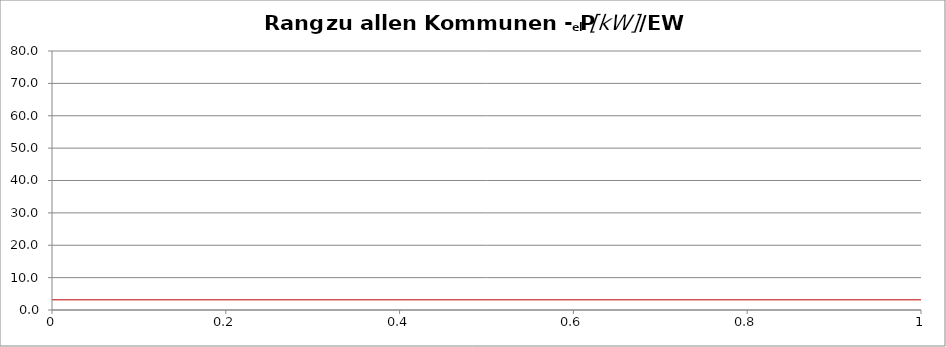
| Category | Kommunenrangfolge |
|---|---|
| 0 | 0.028 |
| 1 | 0.286 |
| 2 | 0.333 |
| 3 | 0.368 |
| 4 | 0.5 |
| 5 | 0.6 |
| 6 | 0.824 |
| 7 | 0.833 |
| 8 | 0.857 |
| 9 | 0.95 |
| 10 | 1 |
| 11 | 1 |
| 12 | 1 |
| 13 | 1 |
| 14 | 1 |
| 15 | 1 |
| 16 | 1 |
| 17 | 1 |
| 18 | 1 |
| 19 | 1 |
| 20 | 1 |
| 21 | 1 |
| 22 | 1 |
| 23 | 1.186 |
| 24 | 1.19 |
| 25 | 1.2 |
| 26 | 1.2 |
| 27 | 1.222 |
| 28 | 1.24 |
| 29 | 1.241 |
| 30 | 1.25 |
| 31 | 1.25 |
| 32 | 1.25 |
| 33 | 1.286 |
| 34 | 1.333 |
| 35 | 1.333 |
| 36 | 1.333 |
| 37 | 1.333 |
| 38 | 1.355 |
| 39 | 1.375 |
| 40 | 1.375 |
| 41 | 1.429 |
| 42 | 1.429 |
| 43 | 1.5 |
| 44 | 1.5 |
| 45 | 1.5 |
| 46 | 1.5 |
| 47 | 1.5 |
| 48 | 1.562 |
| 49 | 1.667 |
| 50 | 1.667 |
| 51 | 1.667 |
| 52 | 1.667 |
| 53 | 1.68 |
| 54 | 1.683 |
| 55 | 1.7 |
| 56 | 1.7 |
| 57 | 1.727 |
| 58 | 1.743 |
| 59 | 1.75 |
| 60 | 1.75 |
| 61 | 1.75 |
| 62 | 1.75 |
| 63 | 1.75 |
| 64 | 1.75 |
| 65 | 1.778 |
| 66 | 1.786 |
| 67 | 1.8 |
| 68 | 1.8 |
| 69 | 1.8 |
| 70 | 1.808 |
| 71 | 1.857 |
| 72 | 1.867 |
| 73 | 1.889 |
| 74 | 1.917 |
| 75 | 1.943 |
| 76 | 1.96 |
| 77 | 2 |
| 78 | 2 |
| 79 | 2 |
| 80 | 2 |
| 81 | 2 |
| 82 | 2 |
| 83 | 2 |
| 84 | 2 |
| 85 | 2 |
| 86 | 2 |
| 87 | 2 |
| 88 | 2 |
| 89 | 2 |
| 90 | 2 |
| 91 | 2 |
| 92 | 2 |
| 93 | 2 |
| 94 | 2 |
| 95 | 2 |
| 96 | 2 |
| 97 | 2 |
| 98 | 2 |
| 99 | 2 |
| 100 | 2.057 |
| 101 | 2.07 |
| 102 | 2.088 |
| 103 | 2.158 |
| 104 | 2.159 |
| 105 | 2.167 |
| 106 | 2.175 |
| 107 | 2.214 |
| 108 | 2.23 |
| 109 | 2.233 |
| 110 | 2.243 |
| 111 | 2.25 |
| 112 | 2.262 |
| 113 | 2.299 |
| 114 | 2.333 |
| 115 | 2.333 |
| 116 | 2.333 |
| 117 | 2.333 |
| 118 | 2.333 |
| 119 | 2.375 |
| 120 | 2.385 |
| 121 | 2.4 |
| 122 | 2.4 |
| 123 | 2.455 |
| 124 | 2.5 |
| 125 | 2.5 |
| 126 | 2.5 |
| 127 | 2.5 |
| 128 | 2.512 |
| 129 | 2.6 |
| 130 | 2.6 |
| 131 | 2.608 |
| 132 | 2.619 |
| 133 | 2.625 |
| 134 | 2.667 |
| 135 | 2.667 |
| 136 | 2.667 |
| 137 | 2.667 |
| 138 | 2.732 |
| 139 | 2.75 |
| 140 | 2.75 |
| 141 | 2.763 |
| 142 | 2.778 |
| 143 | 2.8 |
| 144 | 2.8 |
| 145 | 2.8 |
| 146 | 2.821 |
| 147 | 2.857 |
| 148 | 2.857 |
| 149 | 2.875 |
| 150 | 2.882 |
| 151 | 2.892 |
| 152 | 2.9 |
| 153 | 2.927 |
| 154 | 2.963 |
| 155 | 3 |
| 156 | 3 |
| 157 | 3.056 |
| 158 | 3.083 |
| 159 | 3.095 |
| 160 | 3.125 |
| 161 | 3.2 |
| 162 | 3.375 |
| 163 | 3.382 |
| 164 | 3.453 |
| 165 | 3.5 |
| 166 | 3.5 |
| 167 | 3.5 |
| 168 | 3.5 |
| 169 | 3.5 |
| 170 | 3.6 |
| 171 | 3.6 |
| 172 | 3.724 |
| 173 | 3.8 |
| 174 | 4 |
| 175 | 4 |
| 176 | 4.082 |
| 177 | 4.142 |
| 178 | 4.182 |
| 179 | 4.312 |
| 180 | 4.667 |
| 181 | 4.737 |
| 182 | 5 |
| 183 | 5 |
| 184 | 5.208 |
| 185 | 6.444 |
| 186 | 7.228 |
| 187 | 7.778 |
| 188 | 8.889 |
| 189 | 9.807 |
| 190 | 11.89 |
| 191 | 14 |
| 192 | 15.706 |
| 193 | 70 |
| 194 | 70 |